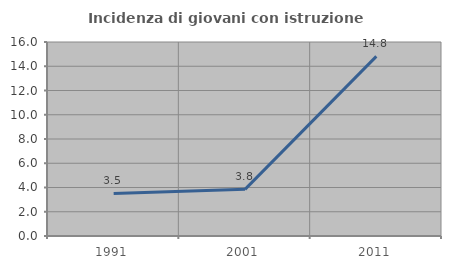
| Category | Incidenza di giovani con istruzione universitaria |
|---|---|
| 1991.0 | 3.509 |
| 2001.0 | 3.846 |
| 2011.0 | 14.815 |